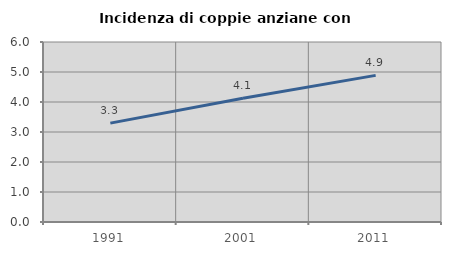
| Category | Incidenza di coppie anziane con figli |
|---|---|
| 1991.0 | 3.296 |
| 2001.0 | 4.126 |
| 2011.0 | 4.888 |